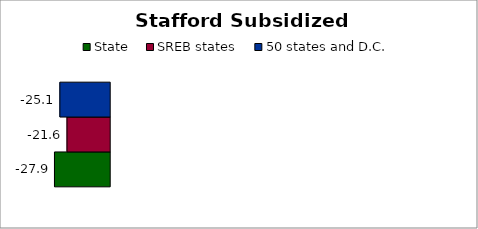
| Category | State | SREB states | 50 states and D.C. |
|---|---|---|---|
| 0 | -27.862 | -21.55 | -25.147 |